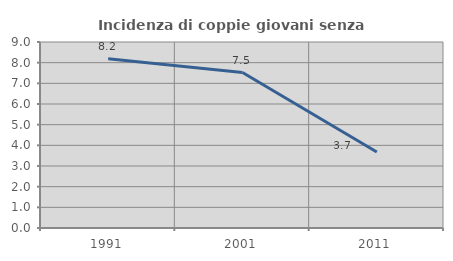
| Category | Incidenza di coppie giovani senza figli |
|---|---|
| 1991.0 | 8.194 |
| 2001.0 | 7.522 |
| 2011.0 | 3.673 |